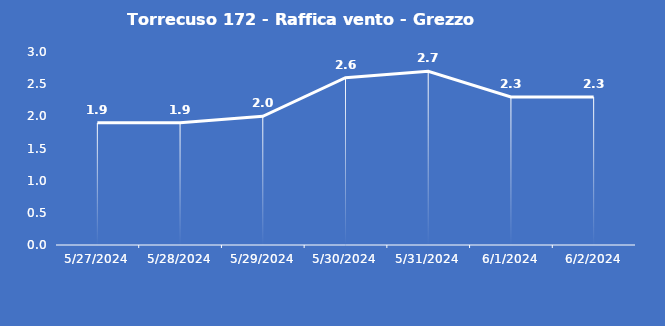
| Category | Torrecuso 172 - Raffica vento - Grezzo (m/s) |
|---|---|
| 5/27/24 | 1.9 |
| 5/28/24 | 1.9 |
| 5/29/24 | 2 |
| 5/30/24 | 2.6 |
| 5/31/24 | 2.7 |
| 6/1/24 | 2.3 |
| 6/2/24 | 2.3 |